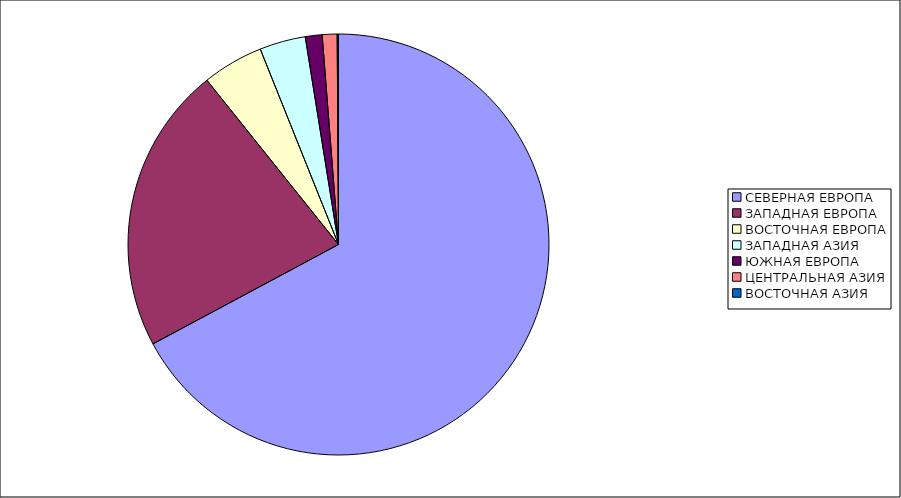
| Category | Оборот |
|---|---|
| СЕВЕРНАЯ ЕВРОПА | 67.17 |
| ЗАПАДНАЯ ЕВРОПА | 22.08 |
| ВОСТОЧНАЯ ЕВРОПА | 4.69 |
| ЗАПАДНАЯ АЗИЯ | 3.53 |
| ЮЖНАЯ ЕВРОПА | 1.29 |
| ЦЕНТРАЛЬНАЯ АЗИЯ | 1.14 |
| ВОСТОЧНАЯ АЗИЯ | 0.1 |